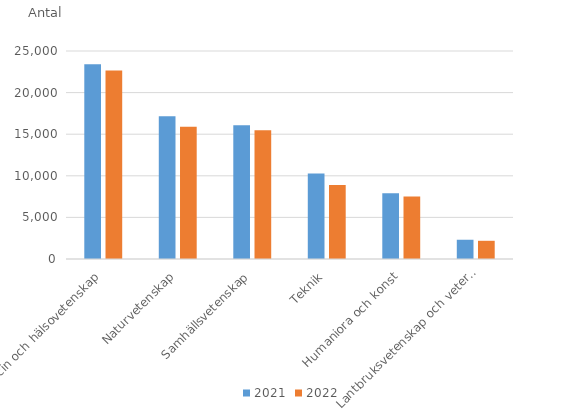
| Category | 2021 | 2022 |
|---|---|---|
| Medicin och hälsovetenskap | 23402 | 22667 |
| Naturvetenskap | 17157 | 15884 |
| Samhällsvetenskap | 16076 | 15466 |
| Teknik | 10272 | 8898 |
| Humaniora och konst | 7909 | 7503 |
| Lantbruksvetenskap och veterinärmedicin | 2314 | 2188 |